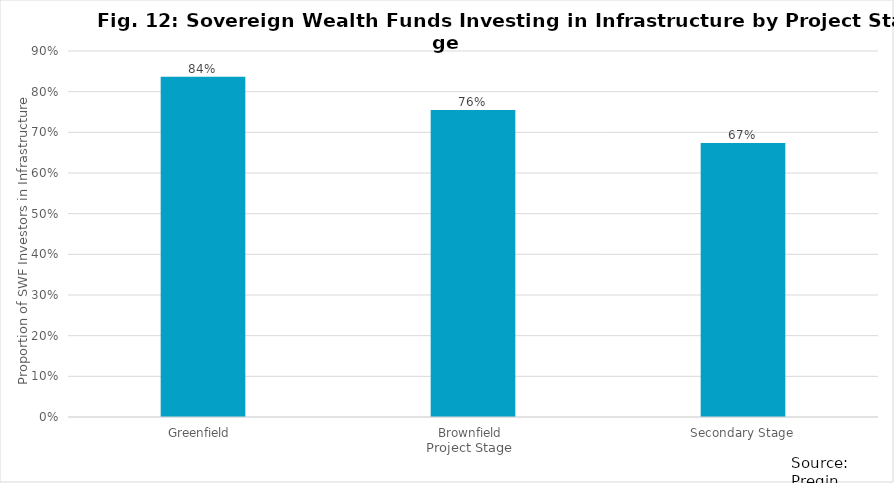
| Category | Series 0 |
|---|---|
| Greenfield  | 0.837 |
| Brownfield  | 0.755 |
| Secondary Stage | 0.673 |